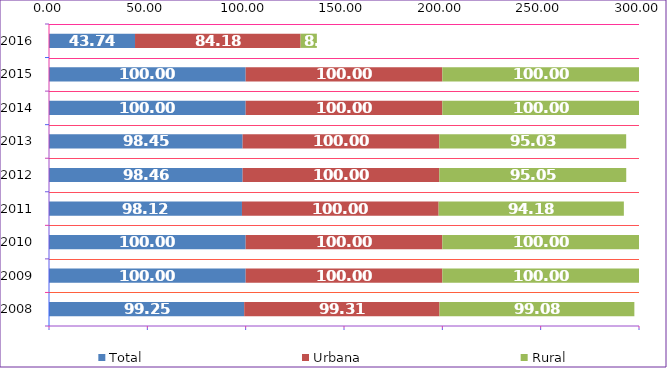
| Category | Total | Urbana | Rural |
|---|---|---|---|
| 2008.0 | 99.25 | 99.31 | 99.08 |
| 2009.0 | 100 | 100 | 100 |
| 2010.0 | 100 | 100 | 100 |
| 2011.0 | 98.12 | 100 | 94.18 |
| 2012.0 | 98.46 | 100 | 95.05 |
| 2013.0 | 98.45 | 100 | 95.03 |
| 2014.0 | 100 | 100 | 100 |
| 2015.0 | 100 | 100 | 100 |
| 2016.0 | 43.74 | 84.18 | 8.28 |